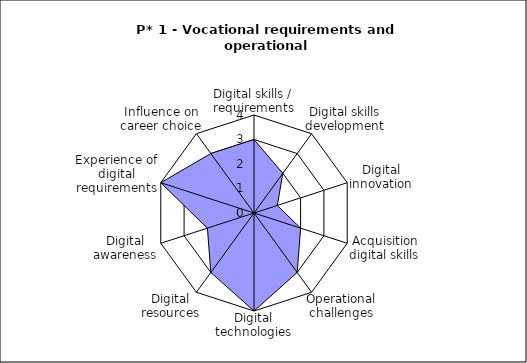
| Category | Series 0 |
|---|---|
| Digital skills / requirements | 3 |
| Digital skills development | 2 |
| Digital innovation | 1 |
| Acquisition digital skills | 2 |
| Operational challenges | 3 |
| Digital technologies | 4 |
| Digital resources | 3 |
| Digital awareness | 2 |
| Experience of digital requirements | 4 |
| Influence on career choice | 3 |